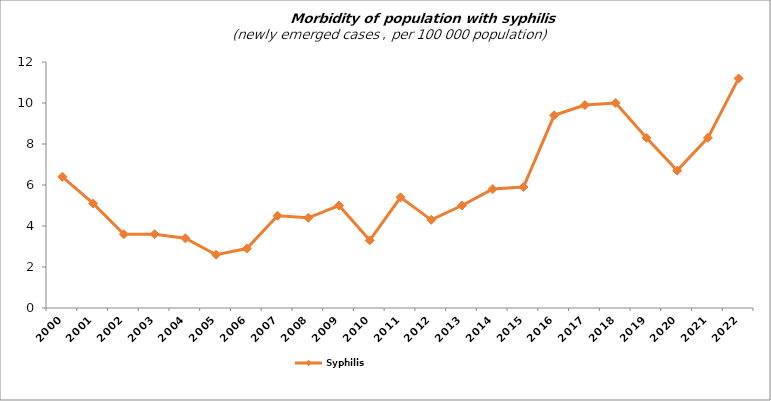
| Category | Syphilis                                                                                                                 |
|---|---|
| 2000.0 | 6.4 |
| 2001.0 | 5.1 |
| 2002.0 | 3.6 |
| 2003.0 | 3.6 |
| 2004.0 | 3.4 |
| 2005.0 | 2.6 |
| 2006.0 | 2.9 |
| 2007.0 | 4.5 |
| 2008.0 | 4.4 |
| 2009.0 | 5 |
| 2010.0 | 3.3 |
| 2011.0 | 5.4 |
| 2012.0 | 4.3 |
| 2013.0 | 5 |
| 2014.0 | 5.8 |
| 2015.0 | 5.9 |
| 2016.0 | 9.4 |
| 2017.0 | 9.9 |
| 2018.0 | 10 |
| 2019.0 | 8.3 |
| 2020.0 | 6.7 |
| 2021.0 | 8.3 |
| 2022.0 | 11.2 |